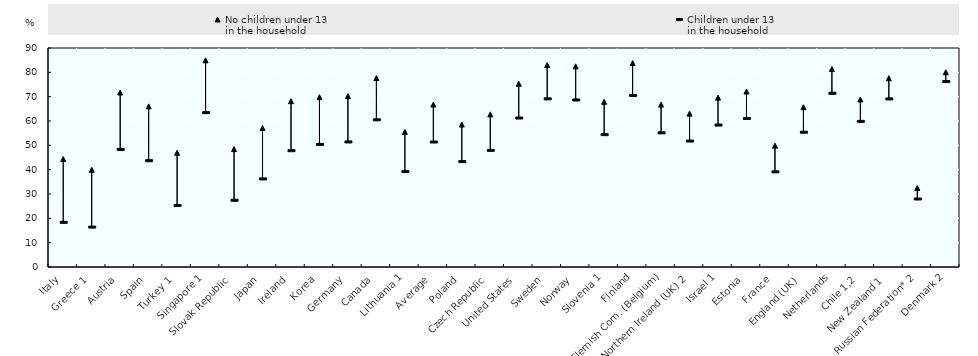
| Category | No children under 13 
in the household | Children under 13 
in the household |
|---|---|---|
| Italy | 44.355 | 18.352 |
| Greece 1 | 39.95 | 16.402 |
| Austria | 71.72 | 48.315 |
| Spain | 66.016 | 43.672 |
| Turkey 1 | 46.969 | 25.267 |
| Singapore 1 | 84.943 | 63.43 |
| Slovak Republic | 48.459 | 27.433 |
| Japan | 57.144 | 36.199 |
| Ireland | 68.146 | 47.787 |
| Korea | 69.802 | 50.4 |
| Germany | 70.204 | 51.401 |
| Canada | 77.641 | 60.482 |
| Lithuania 1 | 55.521 | 39.241 |
| Average | 66.754 | 51.359 |
| Poland | 58.553 | 43.298 |
| Czech Republic | 62.725 | 47.936 |
| United States | 75.313 | 61.223 |
| Sweden | 83.009 | 69.102 |
| Norway | 82.458 | 68.645 |
| Slovenia 1 | 67.889 | 54.405 |
| Finland | 83.813 | 70.488 |
| Flemish Com. (Belgium) | 66.759 | 55.134 |
| Northern Ireland (UK) 2 | 63.03 | 51.758 |
| Israel 1 | 69.604 | 58.334 |
| Estonia | 72.122 | 61.031 |
| France | 49.877 | 39.096 |
| England (UK) | 65.678 | 55.377 |
| Netherlands | 81.357 | 71.382 |
| Chile 1,2 | 68.869 | 59.843 |
| New Zealand 1 | 77.599 | 69.075 |
| Russian Federation* 2 | 32.463 | 27.947 |
| Denmark 2 | 80.042 | 76.216 |